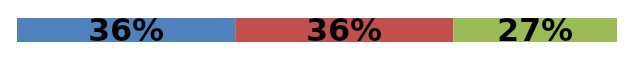
| Category | Series 0 | Series 1 | Series 2 |
|---|---|---|---|
| 0 | 0.364 | 0.364 | 0.273 |